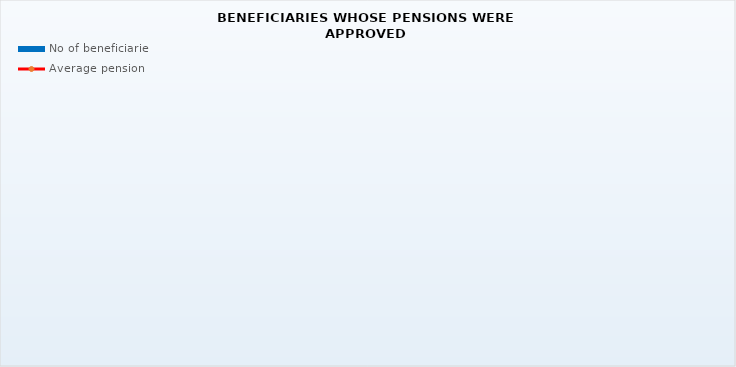
| Category | No of beneficiaries |
|---|---|
| Authorised officials in internal affairs, judicial officers and workers engaged in demining work: | 17264 |
| Active military personnel - DVO  | 15611 |
| Croatian Homeland Army veterans mobilised from 1941 to 1945 | 4246 |
| Former political prisoners | 2857 |
| Croatian Veterans from the Homeland War - ZOHBDR (Act on the Rights of Croatian Homeland War Veterans and their Family Members) | 71200 |
| Pensions approved under general regulations and determined according to the Act on the Rights of Croatian Homeland War Veterans and their Family Members (ZOHBDR), in 2017 (Art. 27, 35, 48 and 49, paragraph 2)    | 41624 |
| Former Yugoslav People's Army members - JNA   | 5545 |
| Former Yugoslav People's Army members - JNA - Art. 185 of Pension Insurance Act (ZOMO)  | 141 |
| National Liberation War veterans - NOR | 10029 |
| Members of the Croatian Parliament, members of the Government, judges of the Constitutional Court and the Auditor General | 675 |
| Members of the Parliamentary Executive Council and administratively retired federal civil servants  (relates to the former SFRY) | 95 |
| Former officials of federal bodies o the former SFRJ -  Article 38 of the Pension Insurance Act (ZOMO) | 34 |
| Full members of the Croatian Academy of Sciences and Arts - HAZU | 142 |
| Miners from the Istrian coal mines "Tupljak" d.d. Labin  | 255 |
| Workers professionally exposed to asbestos | 866 |
| Insurees - crew members on a ship in international and national navigation  - Article  129, paragraph 2 of the Maritime Code | 167 |
| Members of the Croatian Defence Council - HVO  | 6735 |